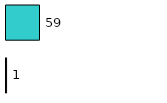
| Category | Series 0 | Series 1 |
|---|---|---|
| 0 | 1 | 59 |